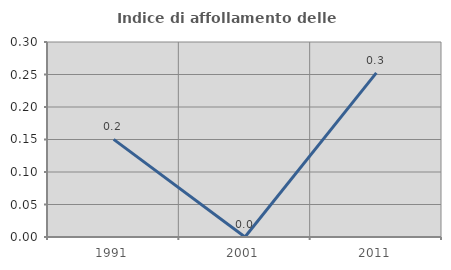
| Category | Indice di affollamento delle abitazioni  |
|---|---|
| 1991.0 | 0.15 |
| 2001.0 | 0 |
| 2011.0 | 0.253 |